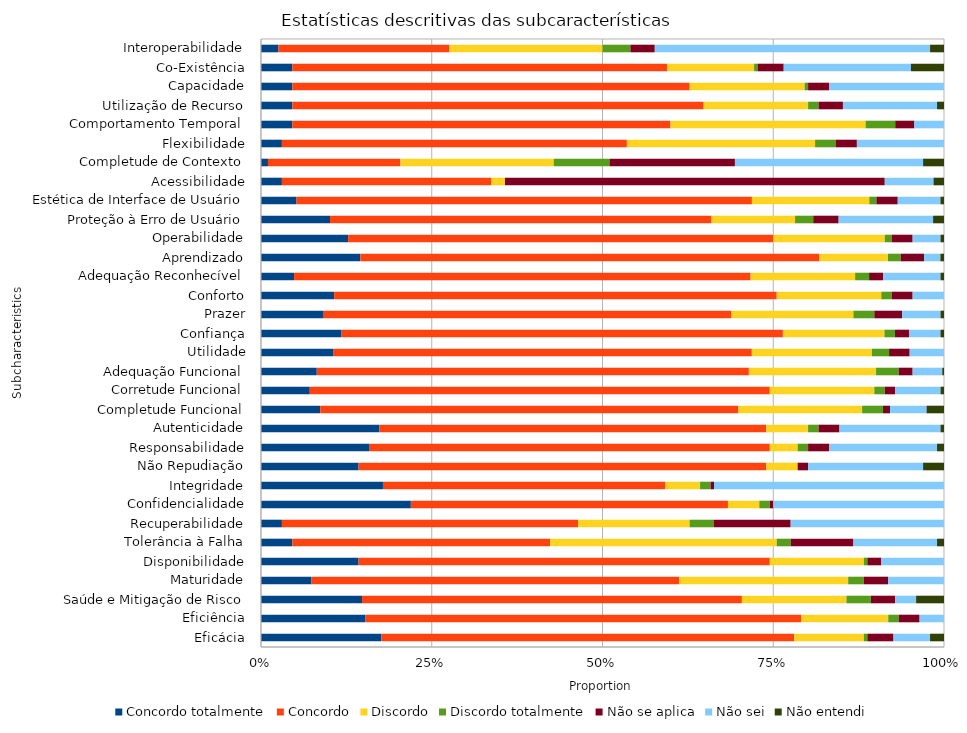
| Category | Concordo totalmente | Concordo | Discordo | Discordo totalmente | Não se aplica | Não sei | Não entendi |
|---|---|---|---|---|---|---|---|
| Eficácia | 34.5 | 118.5 | 20 | 1 | 7.5 | 10.5 | 4 |
| Eficiência | 30 | 125 | 25 | 3 | 6 | 7 | 0 |
| Saúde e Mitigação de Risco | 29 | 109 | 30 | 7 | 7 | 6 | 8 |
| Maturidade | 14.5 | 105.5 | 48.5 | 4.5 | 7 | 16 | 0 |
| Disponibilidade | 28 | 118 | 27 | 1 | 4 | 18 | 0 |
| Tolerância à Falha | 9 | 74 | 65 | 4 | 18 | 24 | 2 |
| Recuperabilidade | 6 | 85 | 32 | 7 | 22 | 44 | 0 |
| Confidencialidade | 43 | 91 | 9 | 3 | 1 | 49 | 0 |
| Integridade | 35 | 81 | 10 | 3 | 1 | 66 | 0 |
| Não Repudiação | 28 | 117 | 9 | 0 | 3 | 33 | 6 |
| Responsabilidade | 31 | 115 | 8 | 3 | 6 | 31 | 2 |
| Autenticidade | 34 | 111 | 12 | 3 | 6 | 29 | 1 |
| Completude Funcional | 17 | 120 | 35.5 | 6 | 2 | 10.5 | 5 |
| Corretude Funcional | 14 | 132 | 30 | 3 | 3 | 13 | 1 |
| Adequação Funcional | 16 | 124 | 36.5 | 6.5 | 4 | 8.5 | 0.5 |
| Utilidade | 21 | 122 | 35 | 5 | 6 | 10 | 0 |
| Confiança | 23 | 126 | 29 | 3 | 4 | 9 | 1 |
| Prazer | 18 | 117 | 35 | 6 | 8 | 11 | 1 |
| Conforto | 21 | 127 | 30 | 3 | 6 | 9 | 0 |
| Adequação Reconhecível | 9.5 | 131 | 30 | 4 | 4 | 16.5 | 1 |
| Aprendizado | 27.5 | 127 | 19 | 3.5 | 6.5 | 4.5 | 1 |
| Operabilidade | 25 | 122 | 32 | 2 | 6 | 8 | 1 |
| Proteção à Erro de Usuário | 19 | 105 | 23 | 5 | 7 | 26 | 3 |
| Estética de Interface de Usuário | 10 | 128 | 33 | 2 | 6 | 12 | 1 |
| Acessibilidade | 6 | 60 | 4 | 0 | 109 | 14 | 3 |
| Completude de Contexto | 2 | 38 | 44 | 16 | 36 | 54 | 6 |
| Flexibilidade | 6 | 99 | 54 | 6 | 6 | 25 | 0 |
| Comportamento Temporal | 9 | 108.5 | 56 | 8.5 | 5.5 | 8.5 | 0 |
| Utilização de Recurso | 9 | 118 | 30 | 3 | 7 | 27 | 2 |
| Capacidade | 9 | 114 | 33 | 1 | 6 | 33 | 0 |
| Co-Existência | 9 | 107.5 | 25 | 1 | 7.5 | 36.5 | 9.5 |
| Interoperabilidade | 5 | 49 | 44 | 8 | 7 | 79 | 4 |